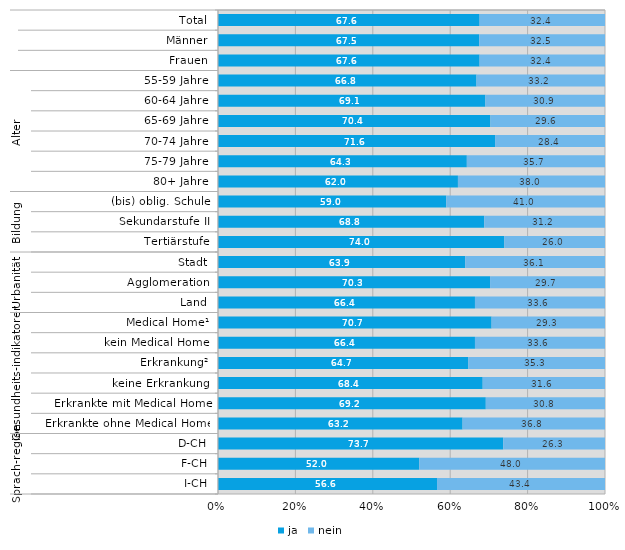
| Category | ja | nein |
|---|---|---|
| 0 | 67.6 | 32.4 |
| 1 | 67.5 | 32.5 |
| 2 | 67.6 | 32.4 |
| 3 | 66.8 | 33.2 |
| 4 | 69.1 | 30.9 |
| 5 | 70.4 | 29.6 |
| 6 | 71.6 | 28.4 |
| 7 | 64.3 | 35.7 |
| 8 | 62 | 38 |
| 9 | 59 | 41 |
| 10 | 68.8 | 31.2 |
| 11 | 74 | 26 |
| 12 | 63.9 | 36.1 |
| 13 | 70.3 | 29.7 |
| 14 | 66.4 | 33.6 |
| 15 | 70.7 | 29.3 |
| 16 | 66.4 | 33.6 |
| 17 | 64.7 | 35.3 |
| 18 | 68.4 | 31.6 |
| 19 | 69.2 | 30.8 |
| 20 | 63.2 | 36.8 |
| 21 | 73.7 | 26.3 |
| 22 | 52 | 48 |
| 23 | 56.6 | 43.4 |